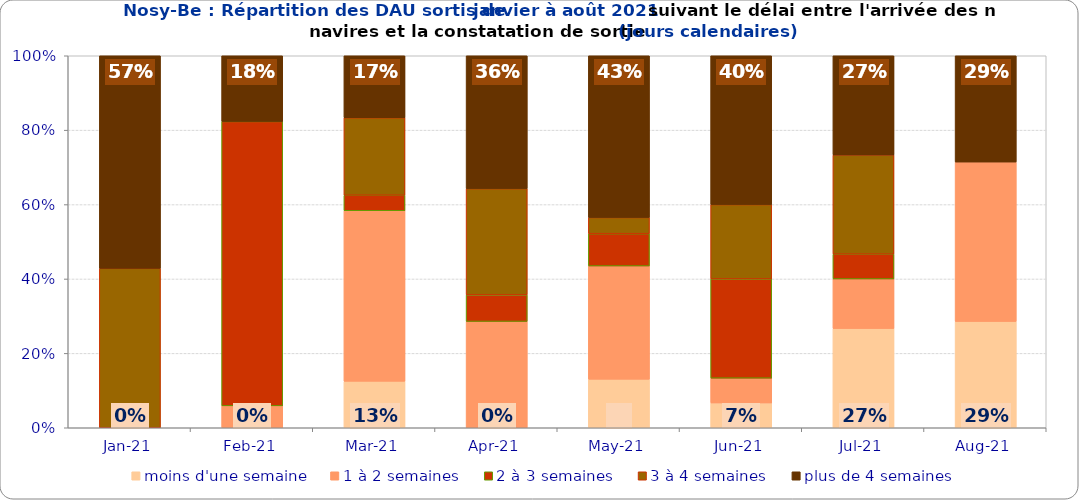
| Category | moins d'une semaine | 1 à 2 semaines | 2 à 3 semaines | 3 à 4 semaines | plus de 4 semaines |
|---|---|---|---|---|---|
| 2021-01-01 | 0 | 0 | 0 | 0.429 | 0.571 |
| 2021-02-01 | 0 | 0.059 | 0.765 | 0 | 0.176 |
| 2021-03-01 | 0.125 | 0.458 | 0.042 | 0.208 | 0.167 |
| 2021-04-01 | 0 | 0.286 | 0.071 | 0.286 | 0.357 |
| 2021-05-01 | 0.13 | 0.304 | 0.087 | 0.043 | 0.435 |
| 2021-06-01 | 0.067 | 0.067 | 0.267 | 0.2 | 0.4 |
| 2021-07-01 | 0.267 | 0.133 | 0.067 | 0.267 | 0.267 |
| 2021-08-01 | 0.286 | 0.429 | 0 | 0 | 0.286 |